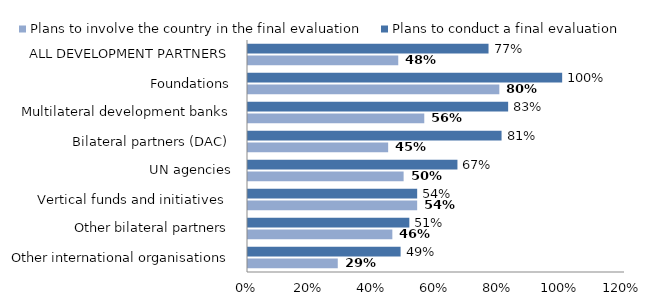
| Category | Plans to involve the country in the final evaluation  | Plans to conduct a final evaluation |
|---|---|---|
| Other international organisations | 0.286 | 0.486 |
| Other bilateral partners | 0.459 | 0.514 |
| Vertical funds and initiatives  | 0.538 | 0.538 |
| UN agencies | 0.495 | 0.667 |
| Bilateral partners (DAC) | 0.446 | 0.807 |
| Multilateral development banks | 0.561 | 0.828 |
| Foundations | 0.8 | 1 |
| ALL DEVELOPMENT PARTNERS | 0.478 | 0.766 |